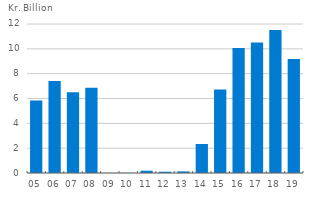
| Category | Dividend payments |
|---|---|
| 05 | 5.839 |
| 06 | 7.405 |
| 07 | 6.503 |
| 08 | 6.857 |
| 09 | 0 |
| 10 | 0 |
| 11 | 0.184 |
| 12 | 0.102 |
| 13 | 0.13 |
| 14 | 2.336 |
| 15 | 6.731 |
| 16 | 10.071 |
| 17 | 10.516 |
| 18 | 11.515 |
| 19 | 9.191 |